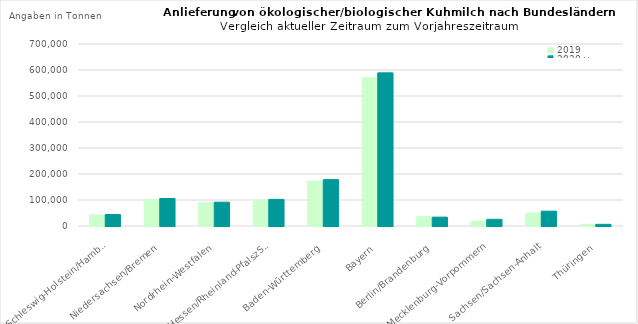
| Category | 2019 | 2020 v |
|---|---|---|
| Schleswig-Holstein/Hamburg | 42355.016 | 44163.811 |
| Niedersachsen/Bremen | 100495.385 | 105780.442 |
| Nordrhein-Westfalen | 89871.708 | 91486.358 |
| Hessen/Rheinland-PfalszSaarland | 98403.929 | 102387.031 |
| Baden-Württemberg | 173162.245 | 178341.934 |
| Bayern | 569363.568 | 588980.925 |
| Berlin/Brandenburg | 35619.232 | 34041.015 |
| Mecklenburg-Vorpommern | 18991.369 | 25689.245 |
| Sachsen/Sachsen-Anhalt | 49999.77 | 56985.444 |
| Thüringen | 6479.797 | 6381.486 |